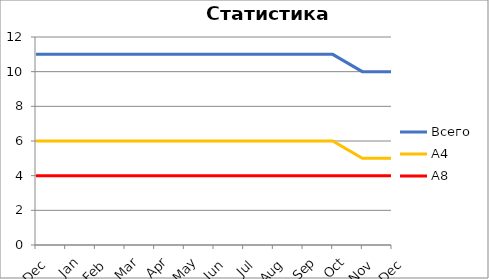
| Category | Всего | А4 | A8 |
|---|---|---|---|
| 0 | 11 | 6 | 4 |
| 1 | 11 | 6 | 4 |
| 2 | 11 | 6 | 4 |
| 3 | 11 | 6 | 4 |
| 4 | 11 | 6 | 4 |
| 5 | 11 | 6 | 4 |
| 6 | 11 | 6 | 4 |
| 7 | 11 | 6 | 4 |
| 8 | 11 | 6 | 4 |
| 9 | 11 | 6 | 4 |
| 10 | 11 | 6 | 4 |
| 11 | 10 | 5 | 4 |
| 12 | 10 | 5 | 4 |